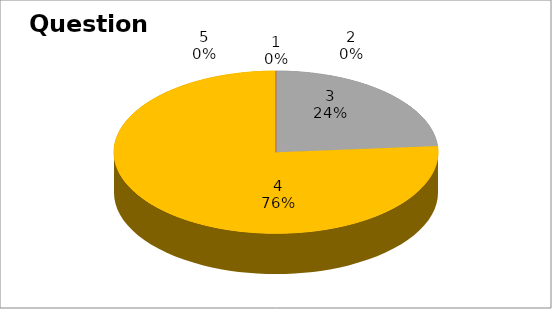
| Category | Series 0 |
|---|---|
| 0 | 0 |
| 1 | 0 |
| 2 | 5 |
| 3 | 16 |
| 4 | 0 |